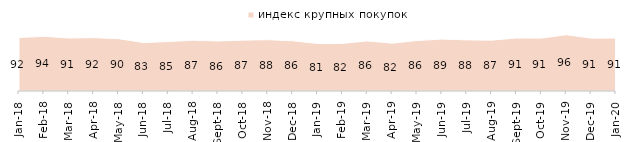
| Category | индекс крупных покупок |
|---|---|
| 2018-01-01 | 91.55 |
| 2018-02-01 | 93.75 |
| 2018-03-01 | 90.85 |
| 2018-04-01 | 91.5 |
| 2018-05-01 | 89.75 |
| 2018-06-01 | 82.95 |
| 2018-07-01 | 84.7 |
| 2018-08-01 | 87.05 |
| 2018-09-01 | 85.65 |
| 2018-10-01 | 87.15 |
| 2018-11-01 | 87.974 |
| 2018-12-01 | 85.95 |
| 2019-01-01 | 81.45 |
| 2019-02-01 | 81.55 |
| 2019-03-01 | 85.828 |
| 2019-04-01 | 81.98 |
| 2019-05-01 | 86.429 |
| 2019-06-01 | 89.027 |
| 2019-07-01 | 87.574 |
| 2019-08-01 | 87.213 |
| 2019-09-01 | 90.842 |
| 2019-10-01 | 90.644 |
| 2019-11-01 | 96.386 |
| 2019-12-01 | 90.644 |
| 2020-01-01 | 90.743 |